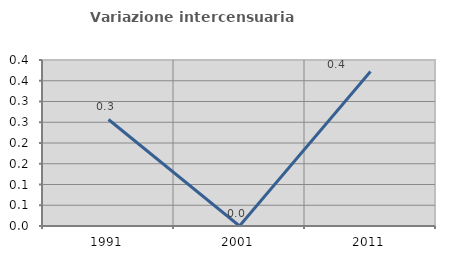
| Category | Variazione intercensuaria annua |
|---|---|
| 1991.0 | 0.257 |
| 2001.0 | 0 |
| 2011.0 | 0.372 |